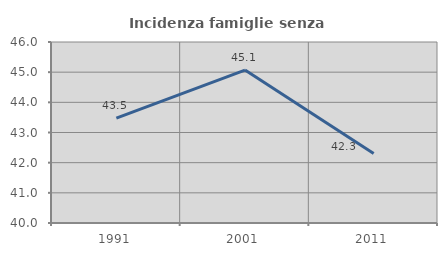
| Category | Incidenza famiglie senza nuclei |
|---|---|
| 1991.0 | 43.478 |
| 2001.0 | 45.07 |
| 2011.0 | 42.308 |